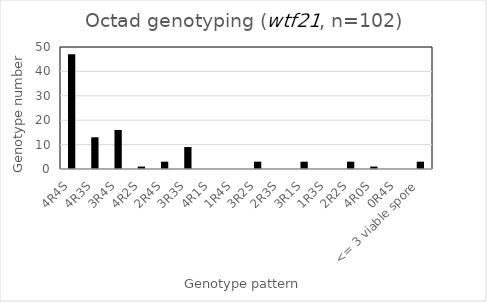
| Category | Number |
|---|---|
| 4R4S | 47 |
| 4R3S | 13 |
| 3R4S | 16 |
| 4R2S | 1 |
| 2R4S | 3 |
| 3R3S | 9 |
| 4R1S | 0 |
| 1R4S | 0 |
| 3R2S | 3 |
| 2R3S | 0 |
| 3R1S | 3 |
| 1R3S | 0 |
| 2R2S | 3 |
| 4R0S | 1 |
| 0R4S | 0 |
| <= 3 viable spore | 3 |